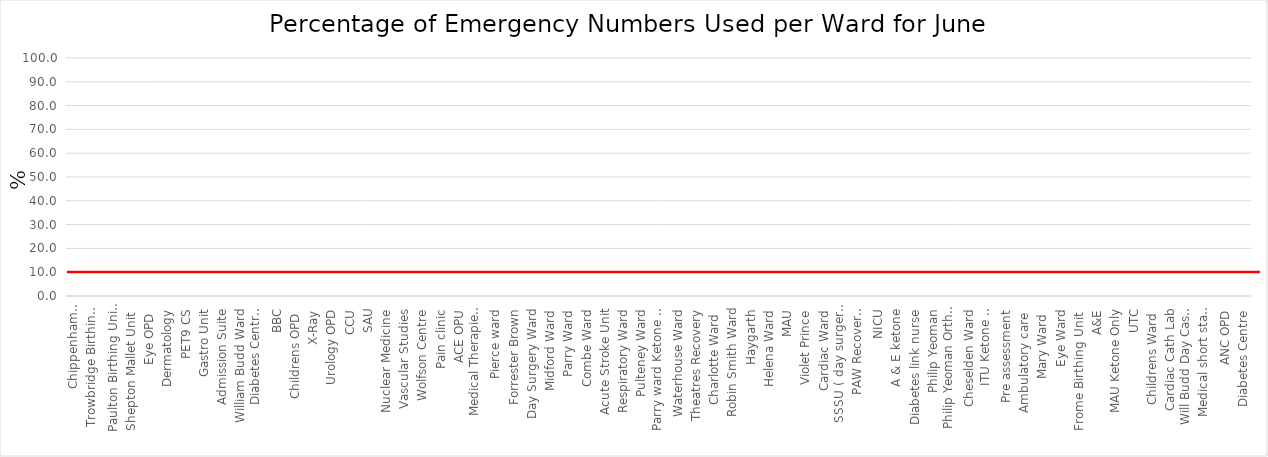
| Category | Series 0 |
|---|---|
| Chippenham Birthing Unit  | 0 |
| Trowbridge Birthing Unit  | 0 |
| Paulton Birthing Unit  | 0 |
| Shepton Mallet Unit  | 0 |
| Eye OPD  | 0 |
| Dermatology | 0 |
| PET9 CS | 0 |
| Gastro Unit | 0 |
| Admission Suite | 0 |
| William Budd Ward | 0 |
| Diabetes Centre Sally Wylie | 0 |
| BBC | 0 |
| Childrens OPD  | 0 |
| X-Ray | 0 |
| Urology OPD | 0 |
| CCU | 0 |
| SAU | 0 |
| Nuclear Medicine | 0 |
| Vascular Studies | 0 |
| Wolfson Centre | 0 |
| Pain clinic | 0 |
| ACE OPU | 0 |
| Medical Therapies Unit | 0 |
| Pierce ward | 0 |
| Forrester Brown | 0 |
| Day Surgery Ward | 0 |
| Midford Ward | 0 |
| Parry Ward | 0 |
| Combe Ward | 0 |
| Acute Stroke Unit | 0 |
| Respiratory Ward | 0 |
| Pulteney Ward | 0 |
| Parry ward Ketone + Glucose | 0 |
| Waterhouse Ward | 0 |
| Theatres Recovery | 0 |
| Charlotte Ward  | 0 |
| Robin Smith Ward | 0 |
| Haygarth | 0 |
| Helena Ward | 0 |
| MAU | 0 |
| Violet Prince | 0 |
| Cardiac Ward | 0 |
| SSSU ( day surgery recovery) | 0 |
| PAW Recovery (Theatres) | 0 |
| NICU | 0 |
| A & E ketone | 0 |
| Diabetes link nurse | 0 |
| Philip Yeoman | 0 |
| Philip Yeoman Ortho Recovery | 0 |
| Cheselden Ward | 0 |
| ITU Ketone + Glucose | 0 |
| Pre assessment | 0 |
| Ambulatory care  | 0 |
| Mary Ward  | 0 |
| Eye Ward | 0 |
| Frome Birthing Unit  | 0 |
| A&E | 0 |
| MAU Ketone Only | 0 |
| UTC | 0 |
| Childrens Ward  | 0 |
| Cardiac Cath Lab | 0 |
| Will Budd Day Case & ONC OPD | 0 |
| Medical short stay Ward | 0 |
| ANC OPD | 0 |
| Diabetes Centre | 0 |